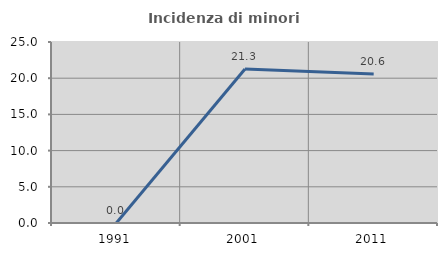
| Category | Incidenza di minori stranieri |
|---|---|
| 1991.0 | 0 |
| 2001.0 | 21.277 |
| 2011.0 | 20.588 |